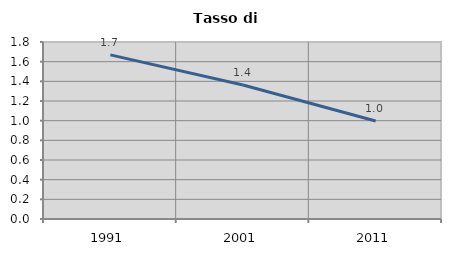
| Category | Tasso di disoccupazione   |
|---|---|
| 1991.0 | 1.669 |
| 2001.0 | 1.362 |
| 2011.0 | 0.996 |